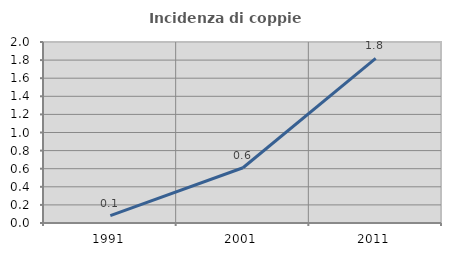
| Category | Incidenza di coppie miste |
|---|---|
| 1991.0 | 0.081 |
| 2001.0 | 0.61 |
| 2011.0 | 1.82 |